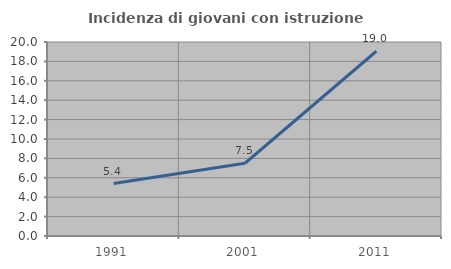
| Category | Incidenza di giovani con istruzione universitaria |
|---|---|
| 1991.0 | 5.405 |
| 2001.0 | 7.5 |
| 2011.0 | 19.048 |